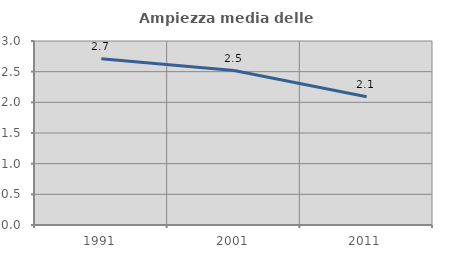
| Category | Ampiezza media delle famiglie |
|---|---|
| 1991.0 | 2.711 |
| 2001.0 | 2.518 |
| 2011.0 | 2.091 |